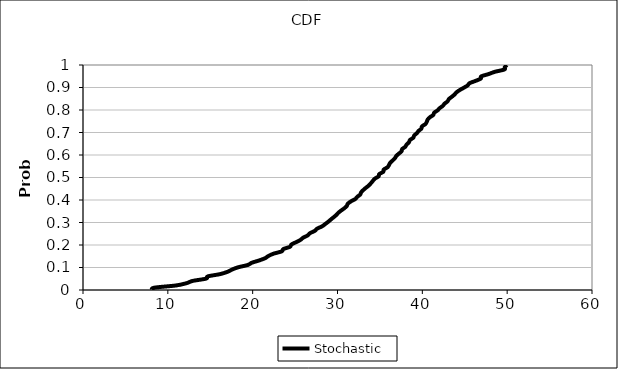
| Category | Stochastic  |
|---|---|
| 8.19585911308994 | 0 |
| 8.37012844243522 | 0.01 |
| 10.970991550023589 | 0.02 |
| 12.205514464974383 | 0.03 |
| 12.92310290276531 | 0.04 |
| 14.503623795927162 | 0.051 |
| 14.723974756828028 | 0.061 |
| 16.167166283056208 | 0.071 |
| 17.03689887958856 | 0.081 |
| 17.573595761146354 | 0.091 |
| 18.290462115476224 | 0.101 |
| 19.415919956512646 | 0.111 |
| 19.909442991711064 | 0.121 |
| 20.758996097153574 | 0.131 |
| 21.470406058432502 | 0.141 |
| 21.872307984904477 | 0.152 |
| 22.47011987456074 | 0.162 |
| 23.43211373010215 | 0.172 |
| 23.602482635797003 | 0.182 |
| 24.391233538107656 | 0.192 |
| 24.562117996402854 | 0.202 |
| 25.09374797774962 | 0.212 |
| 25.618824845204045 | 0.222 |
| 25.951173637077346 | 0.232 |
| 26.480488538459767 | 0.242 |
| 26.758276955207315 | 0.253 |
| 27.313575678166764 | 0.263 |
| 27.603143652495174 | 0.273 |
| 28.177202747109945 | 0.283 |
| 28.54179553076415 | 0.293 |
| 28.90002762044093 | 0.303 |
| 29.213976295695645 | 0.313 |
| 29.53753064890169 | 0.323 |
| 29.85465459455714 | 0.333 |
| 30.101715279319023 | 0.343 |
| 30.443873862098016 | 0.354 |
| 30.814566426219194 | 0.364 |
| 31.09604996448253 | 0.374 |
| 31.22248971636549 | 0.384 |
| 31.585590255690164 | 0.394 |
| 32.08810687324082 | 0.404 |
| 32.33229682897812 | 0.414 |
| 32.67365390806403 | 0.424 |
| 32.78870629921712 | 0.434 |
| 33.046582150270304 | 0.444 |
| 33.355673205262384 | 0.455 |
| 33.695878127415305 | 0.465 |
| 33.941228040437586 | 0.475 |
| 34.16546031074641 | 0.485 |
| 34.404370344714444 | 0.495 |
| 34.84767126796768 | 0.505 |
| 34.92223421446386 | 0.515 |
| 35.396309128454334 | 0.525 |
| 35.4540482266148 | 0.535 |
| 35.89219435278689 | 0.545 |
| 36.06995106861934 | 0.556 |
| 36.21868814049854 | 0.566 |
| 36.50276738652198 | 0.576 |
| 36.77169275282173 | 0.586 |
| 36.934100899807405 | 0.596 |
| 37.231045564334245 | 0.606 |
| 37.5458355387413 | 0.616 |
| 37.61675337019031 | 0.626 |
| 37.98029185207527 | 0.636 |
| 38.14808908778913 | 0.646 |
| 38.42016462396136 | 0.657 |
| 38.54240305089569 | 0.667 |
| 38.93294458696916 | 0.677 |
| 39.04430544544069 | 0.687 |
| 39.35214707156289 | 0.697 |
| 39.56058529652761 | 0.707 |
| 39.886424249186305 | 0.717 |
| 39.959670948415734 | 0.727 |
| 40.36151927959001 | 0.737 |
| 40.522893698508 | 0.747 |
| 40.63092037463131 | 0.758 |
| 40.89005936611395 | 0.768 |
| 41.28499840547739 | 0.778 |
| 41.390144492649426 | 0.788 |
| 41.78442204427846 | 0.798 |
| 42.04122099661415 | 0.808 |
| 42.40800465838049 | 0.818 |
| 42.626391756534936 | 0.828 |
| 42.972016333891204 | 0.838 |
| 43.12671145752933 | 0.848 |
| 43.47093410065981 | 0.859 |
| 43.7899878861162 | 0.869 |
| 44.033594822257385 | 0.879 |
| 44.419749067692706 | 0.889 |
| 44.89139067537445 | 0.899 |
| 45.33690618890663 | 0.909 |
| 45.56998842653522 | 0.919 |
| 46.266841079693044 | 0.929 |
| 46.883223767335885 | 0.939 |
| 46.94430820004298 | 0.949 |
| 47.803228722561556 | 0.96 |
| 48.53881352942766 | 0.97 |
| 49.657529160216484 | 0.98 |
| 49.712099639900075 | 0.99 |
| 49.966713471115916 | 1 |